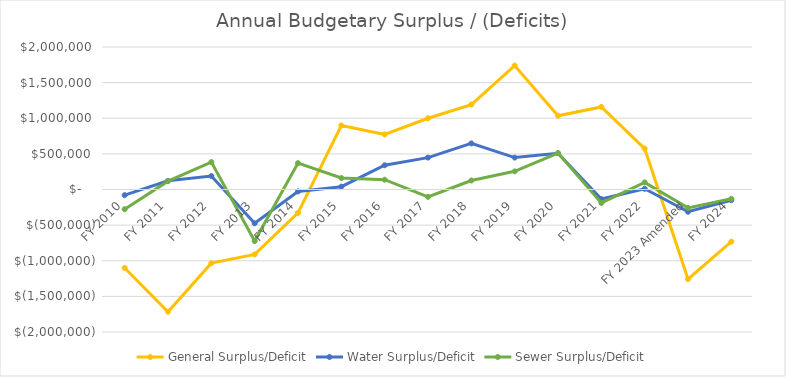
| Category | General Surplus/Deficit | Water Surplus/Deficit | Sewer Surplus/Deficit |
|---|---|---|---|
| FY 2010 | -1101356 | -79263 | -276752 |
| FY 2011 | -1715337 | 121676 | 117225 |
| FY 2012 | -1033737 | 188980 | 385037 |
| FY 2013 | -911091 | -474287 | -723964 |
| FY 2014 | -327884.82 | -27041 | 370285 |
| FY 2015 | 898476 | 39791 | 161163 |
| FY 2016 | 772908 | 340244 | 137409 |
| FY 2017 | 1000127 | 447651 | -103276 |
| FY 2018 | 1192161 | 647005 | 125865 |
| FY 2019 | 1739329 | 447897 | 254904 |
| FY 2020 | 1035062 | 509159 | 510342 |
| FY 2021 | 1159022 | -134012 | -188899 |
| FY 2022 | 574504.57 | 10011.87 | 100520.98 |
| FY 2023 Amended | -1257470 | -312500 | -258405 |
| FY 2024 | -733123 | -150000 | -131000 |